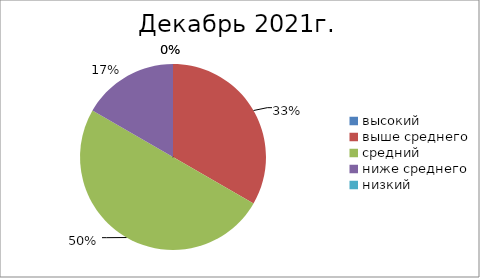
| Category | Series 0 |
|---|---|
| высокий | 0 |
| выше среднего | 2 |
| средний | 3 |
| ниже среднего | 1 |
| низкий | 0 |